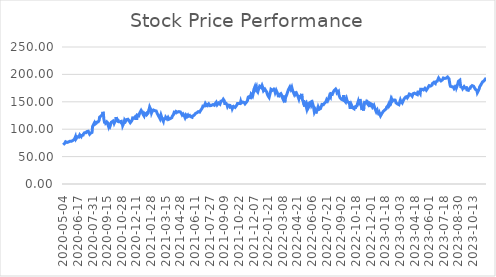
| Category | Series 0 |
|---|---|
| 2020-05-04 | 71.571 |
| 2020-05-05 | 72.645 |
| 2020-05-06 | 73.395 |
| 2020-05-07 | 74.154 |
| 2020-05-08 | 75.919 |
| 2020-05-11 | 77.114 |
| 2020-05-12 | 76.232 |
| 2020-05-13 | 75.312 |
| 2020-05-14 | 75.774 |
| 2020-05-15 | 75.326 |
| 2020-05-18 | 77.101 |
| 2020-05-19 | 76.656 |
| 2020-05-20 | 78.146 |
| 2020-05-21 | 77.564 |
| 2020-05-22 | 78.063 |
| 2020-05-26 | 77.534 |
| 2020-05-27 | 77.872 |
| 2020-05-28 | 77.907 |
| 2020-05-29 | 77.831 |
| 2020-06-01 | 78.788 |
| 2020-06-02 | 79.153 |
| 2020-06-03 | 79.588 |
| 2020-06-04 | 78.903 |
| 2020-06-05 | 81.15 |
| 2020-06-08 | 81.63 |
| 2020-06-09 | 84.208 |
| 2020-06-10 | 86.374 |
| 2020-06-11 | 82.227 |
| 2020-06-12 | 82.937 |
| 2020-06-15 | 83.963 |
| 2020-06-16 | 86.188 |
| 2020-06-17 | 86.068 |
| 2020-06-18 | 86.102 |
| 2020-06-19 | 85.61 |
| 2020-06-22 | 87.85 |
| 2020-06-23 | 89.725 |
| 2020-06-24 | 88.142 |
| 2020-06-25 | 89.312 |
| 2020-06-26 | 86.568 |
| 2020-06-29 | 88.563 |
| 2020-06-30 | 89.302 |
| 2020-07-01 | 89.133 |
| 2020-07-02 | 89.133 |
| 2020-07-06 | 91.517 |
| 2020-07-07 | 91.233 |
| 2020-07-08 | 93.358 |
| 2020-07-09 | 93.76 |
| 2020-07-10 | 93.924 |
| 2020-07-13 | 93.49 |
| 2020-07-14 | 95.038 |
| 2020-07-15 | 95.691 |
| 2020-07-16 | 94.514 |
| 2020-07-17 | 94.323 |
| 2020-07-20 | 96.31 |
| 2020-07-21 | 94.981 |
| 2020-07-22 | 95.248 |
| 2020-07-23 | 90.913 |
| 2020-07-24 | 90.688 |
| 2020-07-27 | 92.837 |
| 2020-07-28 | 91.312 |
| 2020-07-29 | 93.062 |
| 2020-07-30 | 94.188 |
| 2020-07-31 | 104.048 |
| 2020-08-03 | 106.67 |
| 2020-08-04 | 107.383 |
| 2020-08-05 | 107.772 |
| 2020-08-06 | 111.532 |
| 2020-08-07 | 108.996 |
| 2020-08-10 | 110.58 |
| 2020-08-11 | 107.292 |
| 2020-08-12 | 110.858 |
| 2020-08-13 | 112.819 |
| 2020-08-14 | 112.719 |
| 2020-08-17 | 112.425 |
| 2020-08-18 | 113.361 |
| 2020-08-19 | 113.504 |
| 2020-08-20 | 116.022 |
| 2020-08-21 | 122.001 |
| 2020-08-24 | 123.46 |
| 2020-08-25 | 122.448 |
| 2020-08-26 | 124.113 |
| 2020-08-27 | 122.629 |
| 2020-08-28 | 122.43 |
| 2020-08-31 | 126.582 |
| 2020-09-01 | 131.624 |
| 2020-09-02 | 128.897 |
| 2020-09-03 | 118.578 |
| 2020-09-04 | 118.656 |
| 2020-09-08 | 110.671 |
| 2020-09-09 | 115.085 |
| 2020-09-10 | 111.328 |
| 2020-09-11 | 109.867 |
| 2020-09-14 | 113.163 |
| 2020-09-15 | 113.339 |
| 2020-09-16 | 109.994 |
| 2020-09-17 | 108.238 |
| 2020-09-18 | 104.805 |
| 2020-09-21 | 107.983 |
| 2020-09-22 | 109.68 |
| 2020-09-23 | 105.08 |
| 2020-09-24 | 106.159 |
| 2020-09-25 | 110.141 |
| 2020-09-28 | 112.77 |
| 2020-09-29 | 111.917 |
| 2020-09-30 | 113.604 |
| 2020-10-01 | 114.566 |
| 2020-10-02 | 110.867 |
| 2020-10-05 | 114.281 |
| 2020-10-06 | 111.005 |
| 2020-10-07 | 112.888 |
| 2020-10-08 | 112.78 |
| 2020-10-09 | 114.742 |
| 2020-10-12 | 122.031 |
| 2020-10-13 | 118.793 |
| 2020-10-14 | 118.882 |
| 2020-10-15 | 118.411 |
| 2020-10-16 | 116.753 |
| 2020-10-19 | 113.771 |
| 2020-10-20 | 115.272 |
| 2020-10-21 | 114.644 |
| 2020-10-22 | 113.545 |
| 2020-10-23 | 112.849 |
| 2020-10-26 | 112.859 |
| 2020-10-27 | 114.379 |
| 2020-10-28 | 109.082 |
| 2020-10-29 | 113.124 |
| 2020-10-30 | 106.787 |
| 2020-11-02 | 106.698 |
| 2020-11-03 | 108.336 |
| 2020-11-04 | 112.761 |
| 2020-11-05 | 116.763 |
| 2020-11-06 | 116.63 |
| 2020-11-09 | 114.301 |
| 2020-11-10 | 113.957 |
| 2020-11-11 | 117.416 |
| 2020-11-12 | 117.141 |
| 2020-11-13 | 117.19 |
| 2020-11-16 | 118.212 |
| 2020-11-17 | 117.318 |
| 2020-11-18 | 115.982 |
| 2020-11-19 | 116.581 |
| 2020-11-20 | 115.304 |
| 2020-11-23 | 111.874 |
| 2020-11-24 | 113.171 |
| 2020-11-25 | 114.016 |
| 2020-11-27 | 114.567 |
| 2020-11-30 | 116.984 |
| 2020-12-01 | 120.59 |
| 2020-12-02 | 120.944 |
| 2020-12-03 | 120.806 |
| 2020-12-04 | 120.128 |
| 2020-12-07 | 121.602 |
| 2020-12-08 | 122.222 |
| 2020-12-09 | 119.667 |
| 2020-12-10 | 121.101 |
| 2020-12-11 | 120.286 |
| 2020-12-14 | 119.667 |
| 2020-12-15 | 125.661 |
| 2020-12-16 | 125.592 |
| 2020-12-17 | 126.466 |
| 2020-12-18 | 124.462 |
| 2020-12-21 | 126.005 |
| 2020-12-22 | 129.591 |
| 2020-12-23 | 128.687 |
| 2020-12-24 | 129.68 |
| 2020-12-28 | 134.318 |
| 2020-12-29 | 132.529 |
| 2020-12-30 | 131.399 |
| 2020-12-31 | 130.387 |
| 2021-01-04 | 127.164 |
| 2021-01-05 | 128.736 |
| 2021-01-06 | 124.403 |
| 2021-01-07 | 128.648 |
| 2021-01-08 | 129.758 |
| 2021-01-11 | 126.742 |
| 2021-01-12 | 126.565 |
| 2021-01-13 | 128.619 |
| 2021-01-14 | 126.673 |
| 2021-01-15 | 124.934 |
| 2021-01-19 | 125.612 |
| 2021-01-20 | 129.739 |
| 2021-01-21 | 134.495 |
| 2021-01-22 | 136.656 |
| 2021-01-25 | 140.44 |
| 2021-01-26 | 140.676 |
| 2021-01-27 | 139.595 |
| 2021-01-28 | 134.711 |
| 2021-01-29 | 129.67 |
| 2021-02-01 | 131.812 |
| 2021-02-02 | 132.647 |
| 2021-02-03 | 131.616 |
| 2021-02-04 | 135.006 |
| 2021-02-05 | 134.587 |
| 2021-02-08 | 134.735 |
| 2021-02-09 | 133.849 |
| 2021-02-10 | 133.239 |
| 2021-02-11 | 132.983 |
| 2021-02-12 | 133.22 |
| 2021-02-16 | 131.074 |
| 2021-02-17 | 128.762 |
| 2021-02-18 | 127.649 |
| 2021-02-19 | 127.807 |
| 2021-02-22 | 123.998 |
| 2021-02-23 | 123.861 |
| 2021-02-24 | 123.359 |
| 2021-02-25 | 119.068 |
| 2021-02-26 | 119.334 |
| 2021-03-01 | 125.76 |
| 2021-03-02 | 123.132 |
| 2021-03-03 | 120.121 |
| 2021-03-04 | 118.222 |
| 2021-03-05 | 119.491 |
| 2021-03-08 | 114.512 |
| 2021-03-09 | 119.166 |
| 2021-03-10 | 118.074 |
| 2021-03-11 | 120.022 |
| 2021-03-12 | 119.107 |
| 2021-03-15 | 122.02 |
| 2021-03-16 | 123.575 |
| 2021-03-17 | 122.778 |
| 2021-03-18 | 118.615 |
| 2021-03-19 | 118.084 |
| 2021-03-22 | 121.43 |
| 2021-03-23 | 120.593 |
| 2021-03-24 | 118.182 |
| 2021-03-25 | 118.674 |
| 2021-03-26 | 119.284 |
| 2021-03-29 | 119.462 |
| 2021-03-30 | 117.995 |
| 2021-03-31 | 120.21 |
| 2021-04-01 | 121.046 |
| 2021-04-05 | 123.9 |
| 2021-04-06 | 124.205 |
| 2021-04-07 | 125.868 |
| 2021-04-08 | 128.289 |
| 2021-04-09 | 130.887 |
| 2021-04-12 | 129.155 |
| 2021-04-13 | 132.294 |
| 2021-04-14 | 129.933 |
| 2021-04-15 | 132.363 |
| 2021-04-16 | 132.029 |
| 2021-04-19 | 132.698 |
| 2021-04-20 | 130.995 |
| 2021-04-21 | 131.379 |
| 2021-04-22 | 129.844 |
| 2021-04-23 | 132.186 |
| 2021-04-26 | 132.58 |
| 2021-04-27 | 132.255 |
| 2021-04-28 | 131.458 |
| 2021-04-29 | 131.36 |
| 2021-04-30 | 129.372 |
| 2021-05-03 | 130.435 |
| 2021-05-04 | 125.819 |
| 2021-05-05 | 126.065 |
| 2021-05-06 | 127.679 |
| 2021-05-07 | 128.359 |
| 2021-05-10 | 125.047 |
| 2021-05-11 | 124.12 |
| 2021-05-12 | 121.025 |
| 2021-05-13 | 123.194 |
| 2021-05-14 | 125.638 |
| 2021-05-17 | 124.475 |
| 2021-05-18 | 123.075 |
| 2021-05-19 | 122.918 |
| 2021-05-20 | 125.5 |
| 2021-05-21 | 123.647 |
| 2021-05-24 | 125.293 |
| 2021-05-25 | 125.096 |
| 2021-05-26 | 125.047 |
| 2021-05-27 | 123.499 |
| 2021-05-28 | 122.839 |
| 2021-06-01 | 122.513 |
| 2021-06-02 | 123.282 |
| 2021-06-03 | 121.784 |
| 2021-06-04 | 124.1 |
| 2021-06-07 | 124.11 |
| 2021-06-08 | 124.938 |
| 2021-06-09 | 125.323 |
| 2021-06-10 | 124.317 |
| 2021-06-11 | 125.54 |
| 2021-06-14 | 128.625 |
| 2021-06-15 | 127.797 |
| 2021-06-16 | 128.3 |
| 2021-06-17 | 129.917 |
| 2021-06-18 | 128.606 |
| 2021-06-21 | 130.419 |
| 2021-06-22 | 132.076 |
| 2021-06-23 | 131.8 |
| 2021-06-24 | 131.514 |
| 2021-06-25 | 131.218 |
| 2021-06-28 | 132.864 |
| 2021-06-29 | 134.392 |
| 2021-06-30 | 135.013 |
| 2021-07-01 | 135.319 |
| 2021-07-02 | 137.97 |
| 2021-07-06 | 140.001 |
| 2021-07-07 | 142.515 |
| 2021-07-08 | 141.204 |
| 2021-07-09 | 143.047 |
| 2021-07-12 | 142.446 |
| 2021-07-13 | 143.57 |
| 2021-07-14 | 147.03 |
| 2021-07-15 | 146.369 |
| 2021-07-16 | 144.309 |
| 2021-07-19 | 140.425 |
| 2021-07-20 | 144.073 |
| 2021-07-21 | 143.333 |
| 2021-07-22 | 144.713 |
| 2021-07-23 | 146.448 |
| 2021-07-26 | 146.872 |
| 2021-07-27 | 144.684 |
| 2021-07-28 | 142.919 |
| 2021-07-29 | 143.57 |
| 2021-07-30 | 143.787 |
| 2021-08-02 | 143.452 |
| 2021-08-03 | 145.265 |
| 2021-08-04 | 144.861 |
| 2021-08-05 | 144.97 |
| 2021-08-06 | 144.278 |
| 2021-08-09 | 144.229 |
| 2021-08-10 | 143.745 |
| 2021-08-11 | 144.002 |
| 2021-08-12 | 146.994 |
| 2021-08-13 | 147.201 |
| 2021-08-16 | 149.195 |
| 2021-08-17 | 148.277 |
| 2021-08-18 | 144.496 |
| 2021-08-19 | 144.831 |
| 2021-08-20 | 146.302 |
| 2021-08-23 | 147.803 |
| 2021-08-24 | 147.714 |
| 2021-08-25 | 146.47 |
| 2021-08-26 | 145.661 |
| 2021-08-27 | 146.707 |
| 2021-08-30 | 151.17 |
| 2021-08-31 | 149.896 |
| 2021-09-01 | 150.567 |
| 2021-09-02 | 151.693 |
| 2021-09-03 | 152.335 |
| 2021-09-07 | 154.694 |
| 2021-09-08 | 153.134 |
| 2021-09-09 | 152.108 |
| 2021-09-10 | 147.072 |
| 2021-09-13 | 147.645 |
| 2021-09-14 | 146.233 |
| 2021-09-15 | 147.132 |
| 2021-09-16 | 146.895 |
| 2021-09-17 | 144.2 |
| 2021-09-20 | 141.119 |
| 2021-09-21 | 141.603 |
| 2021-09-22 | 143.992 |
| 2021-09-23 | 144.96 |
| 2021-09-24 | 145.049 |
| 2021-09-27 | 143.518 |
| 2021-09-28 | 140.102 |
| 2021-09-29 | 141.011 |
| 2021-09-30 | 139.698 |
| 2021-10-01 | 140.833 |
| 2021-10-04 | 137.368 |
| 2021-10-05 | 139.313 |
| 2021-10-06 | 140.191 |
| 2021-10-07 | 141.465 |
| 2021-10-08 | 141.08 |
| 2021-10-11 | 140.991 |
| 2021-10-12 | 139.708 |
| 2021-10-13 | 139.115 |
| 2021-10-14 | 141.929 |
| 2021-10-15 | 142.995 |
| 2021-10-18 | 144.683 |
| 2021-10-19 | 146.865 |
| 2021-10-20 | 147.359 |
| 2021-10-21 | 147.576 |
| 2021-10-22 | 146.796 |
| 2021-10-25 | 146.747 |
| 2021-10-26 | 147.418 |
| 2021-10-27 | 146.954 |
| 2021-10-28 | 150.627 |
| 2021-10-29 | 147.892 |
| 2021-11-01 | 147.063 |
| 2021-11-02 | 148.109 |
| 2021-11-03 | 149.56 |
| 2021-11-04 | 149.037 |
| 2021-11-05 | 149.571 |
| 2021-11-08 | 148.74 |
| 2021-11-09 | 149.106 |
| 2021-11-10 | 146.249 |
| 2021-11-11 | 146.2 |
| 2021-11-12 | 148.296 |
| 2021-11-15 | 148.306 |
| 2021-11-16 | 149.294 |
| 2021-11-17 | 151.756 |
| 2021-11-18 | 156.087 |
| 2021-11-19 | 158.736 |
| 2021-11-22 | 159.201 |
| 2021-11-23 | 159.587 |
| 2021-11-24 | 160.111 |
| 2021-11-26 | 155.039 |
| 2021-11-29 | 158.43 |
| 2021-11-30 | 163.433 |
| 2021-12-01 | 162.909 |
| 2021-12-02 | 161.91 |
| 2021-12-03 | 160.012 |
| 2021-12-06 | 163.452 |
| 2021-12-07 | 169.246 |
| 2021-12-08 | 173.102 |
| 2021-12-09 | 172.588 |
| 2021-12-10 | 177.423 |
| 2021-12-13 | 173.755 |
| 2021-12-14 | 172.361 |
| 2021-12-15 | 177.274 |
| 2021-12-16 | 170.314 |
| 2021-12-17 | 169.207 |
| 2021-12-20 | 167.832 |
| 2021-12-21 | 171.036 |
| 2021-12-22 | 173.656 |
| 2021-12-23 | 174.289 |
| 2021-12-27 | 178.293 |
| 2021-12-28 | 177.265 |
| 2021-12-29 | 177.354 |
| 2021-12-30 | 176.187 |
| 2021-12-31 | 175.564 |
| 2022-01-03 | 179.954 |
| 2022-01-04 | 177.67 |
| 2022-01-05 | 172.944 |
| 2022-01-06 | 170.057 |
| 2022-01-07 | 170.225 |
| 2022-01-10 | 170.245 |
| 2022-01-11 | 173.102 |
| 2022-01-12 | 173.547 |
| 2022-01-13 | 170.245 |
| 2022-01-14 | 171.115 |
| 2022-01-18 | 167.882 |
| 2022-01-19 | 164.352 |
| 2022-01-20 | 162.652 |
| 2022-01-21 | 160.575 |
| 2022-01-24 | 159.794 |
| 2022-01-25 | 157.975 |
| 2022-01-26 | 157.886 |
| 2022-01-27 | 157.421 |
| 2022-01-28 | 168.406 |
| 2022-01-31 | 172.806 |
| 2022-02-01 | 172.638 |
| 2022-02-02 | 173.854 |
| 2022-02-03 | 170.947 |
| 2022-02-04 | 170.66 |
| 2022-02-07 | 169.937 |
| 2022-02-08 | 173.075 |
| 2022-02-09 | 174.511 |
| 2022-02-10 | 170.392 |
| 2022-02-11 | 166.947 |
| 2022-02-14 | 167.185 |
| 2022-02-15 | 171.056 |
| 2022-02-16 | 170.818 |
| 2022-02-17 | 167.185 |
| 2022-02-18 | 165.621 |
| 2022-02-22 | 162.671 |
| 2022-02-23 | 158.463 |
| 2022-02-24 | 161.107 |
| 2022-02-25 | 163.195 |
| 2022-02-28 | 163.463 |
| 2022-03-01 | 161.562 |
| 2022-03-02 | 164.888 |
| 2022-03-03 | 164.562 |
| 2022-03-04 | 161.532 |
| 2022-03-07 | 157.701 |
| 2022-03-08 | 155.86 |
| 2022-03-09 | 161.314 |
| 2022-03-10 | 156.929 |
| 2022-03-11 | 153.177 |
| 2022-03-14 | 149.108 |
| 2022-03-15 | 153.533 |
| 2022-03-16 | 157.988 |
| 2022-03-17 | 159.008 |
| 2022-03-18 | 162.334 |
| 2022-03-21 | 163.72 |
| 2022-03-22 | 167.126 |
| 2022-03-23 | 168.502 |
| 2022-03-24 | 172.323 |
| 2022-03-25 | 172.966 |
| 2022-03-28 | 173.838 |
| 2022-03-29 | 177.164 |
| 2022-03-30 | 175.986 |
| 2022-03-31 | 172.857 |
| 2022-04-01 | 172.56 |
| 2022-04-04 | 176.649 |
| 2022-04-05 | 173.303 |
| 2022-04-06 | 170.105 |
| 2022-04-07 | 170.412 |
| 2022-04-08 | 168.383 |
| 2022-04-11 | 164.086 |
| 2022-04-12 | 165.977 |
| 2022-04-13 | 168.69 |
| 2022-04-14 | 163.631 |
| 2022-04-18 | 163.413 |
| 2022-04-19 | 165.72 |
| 2022-04-20 | 165.552 |
| 2022-04-21 | 164.75 |
| 2022-04-22 | 160.166 |
| 2022-04-25 | 161.245 |
| 2022-04-26 | 155.226 |
| 2022-04-27 | 154.998 |
| 2022-04-28 | 161.998 |
| 2022-04-29 | 156.068 |
| 2022-05-02 | 156.375 |
| 2022-05-03 | 157.879 |
| 2022-05-04 | 164.354 |
| 2022-05-05 | 155.196 |
| 2022-05-06 | 155.93 |
| 2022-05-09 | 150.755 |
| 2022-05-10 | 153.184 |
| 2022-05-11 | 145.243 |
| 2022-05-12 | 141.336 |
| 2022-05-13 | 145.847 |
| 2022-05-16 | 144.291 |
| 2022-05-17 | 147.959 |
| 2022-05-18 | 139.611 |
| 2022-05-19 | 136.171 |
| 2022-05-20 | 136.409 |
| 2022-05-23 | 141.882 |
| 2022-05-24 | 139.155 |
| 2022-05-25 | 139.314 |
| 2022-05-26 | 142.546 |
| 2022-05-27 | 148.356 |
| 2022-05-31 | 147.563 |
| 2022-06-01 | 147.434 |
| 2022-06-02 | 149.912 |
| 2022-06-03 | 144.132 |
| 2022-06-06 | 144.886 |
| 2022-06-07 | 147.434 |
| 2022-06-08 | 146.69 |
| 2022-06-09 | 141.416 |
| 2022-06-10 | 135.953 |
| 2022-06-13 | 130.748 |
| 2022-06-14 | 131.621 |
| 2022-06-15 | 134.268 |
| 2022-06-16 | 128.944 |
| 2022-06-17 | 130.431 |
| 2022-06-21 | 134.704 |
| 2022-06-22 | 134.188 |
| 2022-06-23 | 137.083 |
| 2022-06-24 | 140.444 |
| 2022-06-27 | 140.444 |
| 2022-06-28 | 136.26 |
| 2022-06-29 | 138.035 |
| 2022-06-30 | 135.547 |
| 2022-07-01 | 137.738 |
| 2022-07-05 | 140.345 |
| 2022-07-06 | 141.693 |
| 2022-07-07 | 145.094 |
| 2022-07-08 | 145.778 |
| 2022-07-11 | 143.627 |
| 2022-07-12 | 144.608 |
| 2022-07-13 | 144.241 |
| 2022-07-14 | 147.196 |
| 2022-07-15 | 148.881 |
| 2022-07-18 | 145.808 |
| 2022-07-19 | 149.704 |
| 2022-07-20 | 151.726 |
| 2022-07-21 | 154.017 |
| 2022-07-22 | 152.768 |
| 2022-07-25 | 151.637 |
| 2022-07-26 | 150.299 |
| 2022-07-27 | 155.444 |
| 2022-07-28 | 156 |
| 2022-07-29 | 161.115 |
| 2022-08-01 | 160.124 |
| 2022-08-02 | 158.637 |
| 2022-08-03 | 164.704 |
| 2022-08-04 | 164.387 |
| 2022-08-05 | 164.159 |
| 2022-08-08 | 163.682 |
| 2022-08-09 | 163.732 |
| 2022-08-10 | 168.021 |
| 2022-08-11 | 167.276 |
| 2022-08-12 | 170.86 |
| 2022-08-15 | 171.942 |
| 2022-08-16 | 171.783 |
| 2022-08-17 | 173.292 |
| 2022-08-18 | 172.895 |
| 2022-08-19 | 170.284 |
| 2022-08-22 | 166.363 |
| 2022-08-23 | 166.025 |
| 2022-08-24 | 166.323 |
| 2022-08-25 | 168.805 |
| 2022-08-26 | 162.441 |
| 2022-08-29 | 160.217 |
| 2022-08-30 | 157.765 |
| 2022-08-31 | 156.087 |
| 2022-09-01 | 156.822 |
| 2022-09-02 | 154.687 |
| 2022-09-06 | 153.417 |
| 2022-09-07 | 154.836 |
| 2022-09-08 | 153.347 |
| 2022-09-09 | 156.236 |
| 2022-09-12 | 162.252 |
| 2022-09-13 | 152.732 |
| 2022-09-14 | 154.191 |
| 2022-09-15 | 151.272 |
| 2022-09-16 | 149.614 |
| 2022-09-19 | 153.367 |
| 2022-09-20 | 155.77 |
| 2022-09-21 | 152.612 |
| 2022-09-22 | 151.64 |
| 2022-09-23 | 149.346 |
| 2022-09-26 | 149.684 |
| 2022-09-27 | 150.666 |
| 2022-09-28 | 148.76 |
| 2022-09-29 | 141.453 |
| 2022-09-30 | 137.204 |
| 2022-10-03 | 141.424 |
| 2022-10-04 | 145.047 |
| 2022-10-05 | 145.345 |
| 2022-10-06 | 144.382 |
| 2022-10-07 | 139.081 |
| 2022-10-10 | 139.408 |
| 2022-10-11 | 137.979 |
| 2022-10-12 | 137.343 |
| 2022-10-13 | 141.96 |
| 2022-10-14 | 137.383 |
| 2022-10-17 | 141.384 |
| 2022-10-18 | 142.714 |
| 2022-10-19 | 142.823 |
| 2022-10-20 | 142.357 |
| 2022-10-21 | 146.209 |
| 2022-10-24 | 148.373 |
| 2022-10-25 | 151.242 |
| 2022-10-26 | 148.274 |
| 2022-10-27 | 143.757 |
| 2022-10-28 | 154.618 |
| 2022-10-31 | 152.235 |
| 2022-11-01 | 149.564 |
| 2022-11-02 | 143.985 |
| 2022-11-03 | 137.879 |
| 2022-11-04 | 137.611 |
| 2022-11-07 | 138.148 |
| 2022-11-08 | 138.725 |
| 2022-11-09 | 134.12 |
| 2022-11-10 | 146.054 |
| 2022-11-11 | 148.868 |
| 2022-11-14 | 147.456 |
| 2022-11-15 | 149.206 |
| 2022-11-16 | 147.963 |
| 2022-11-17 | 149.882 |
| 2022-11-18 | 150.449 |
| 2022-11-21 | 147.187 |
| 2022-11-22 | 149.345 |
| 2022-11-23 | 150.23 |
| 2022-11-25 | 147.287 |
| 2022-11-28 | 143.418 |
| 2022-11-29 | 140.385 |
| 2022-11-30 | 147.207 |
| 2022-12-01 | 147.486 |
| 2022-12-02 | 146.988 |
| 2022-12-05 | 145.815 |
| 2022-12-06 | 142.116 |
| 2022-12-07 | 140.157 |
| 2022-12-08 | 141.857 |
| 2022-12-09 | 141.37 |
| 2022-12-12 | 143.687 |
| 2022-12-13 | 144.661 |
| 2022-12-14 | 142.414 |
| 2022-12-15 | 135.741 |
| 2022-12-16 | 133.762 |
| 2022-12-19 | 131.634 |
| 2022-12-20 | 131.565 |
| 2022-12-21 | 134.697 |
| 2022-12-22 | 131.495 |
| 2022-12-23 | 131.127 |
| 2022-12-27 | 129.307 |
| 2022-12-28 | 125.339 |
| 2022-12-29 | 128.89 |
| 2022-12-30 | 129.208 |
| 2023-01-03 | 124.375 |
| 2023-01-04 | 125.658 |
| 2023-01-05 | 124.325 |
| 2023-01-06 | 128.899 |
| 2023-01-09 | 129.427 |
| 2023-01-10 | 130.003 |
| 2023-01-11 | 132.748 |
| 2023-01-12 | 132.668 |
| 2023-01-13 | 134.011 |
| 2023-01-17 | 135.184 |
| 2023-01-18 | 134.458 |
| 2023-01-19 | 134.518 |
| 2023-01-20 | 137.104 |
| 2023-01-23 | 140.326 |
| 2023-01-24 | 141.738 |
| 2023-01-25 | 141.072 |
| 2023-01-26 | 143.16 |
| 2023-01-27 | 145.119 |
| 2023-01-30 | 142.205 |
| 2023-01-31 | 143.488 |
| 2023-02-01 | 144.622 |
| 2023-02-02 | 149.982 |
| 2023-02-03 | 153.641 |
| 2023-02-06 | 150.887 |
| 2023-02-07 | 153.79 |
| 2023-02-08 | 151.076 |
| 2023-02-09 | 150.031 |
| 2023-02-10 | 150.4 |
| 2023-02-13 | 153.228 |
| 2023-02-14 | 152.581 |
| 2023-02-15 | 154.702 |
| 2023-02-16 | 153.089 |
| 2023-02-17 | 151.934 |
| 2023-02-21 | 147.88 |
| 2023-02-22 | 148.308 |
| 2023-02-23 | 148.796 |
| 2023-02-24 | 146.117 |
| 2023-02-27 | 147.322 |
| 2023-02-28 | 146.814 |
| 2023-03-01 | 144.723 |
| 2023-03-02 | 145.32 |
| 2023-03-03 | 150.42 |
| 2023-03-06 | 153.208 |
| 2023-03-07 | 150.988 |
| 2023-03-08 | 152.252 |
| 2023-03-09 | 149.982 |
| 2023-03-10 | 147.9 |
| 2023-03-13 | 149.862 |
| 2023-03-14 | 151.974 |
| 2023-03-15 | 152.372 |
| 2023-03-16 | 155.22 |
| 2023-03-17 | 154.374 |
| 2023-03-20 | 156.764 |
| 2023-03-21 | 158.636 |
| 2023-03-22 | 157.192 |
| 2023-03-23 | 158.288 |
| 2023-03-24 | 159.603 |
| 2023-03-27 | 157.64 |
| 2023-03-28 | 157.013 |
| 2023-03-29 | 160.12 |
| 2023-03-30 | 161.704 |
| 2023-03-31 | 164.234 |
| 2023-04-03 | 165.499 |
| 2023-04-04 | 164.961 |
| 2023-04-05 | 163.098 |
| 2023-04-06 | 163.995 |
| 2023-04-10 | 161.375 |
| 2023-04-11 | 160.15 |
| 2023-04-12 | 159.453 |
| 2023-04-13 | 164.891 |
| 2023-04-14 | 164.542 |
| 2023-04-17 | 164.562 |
| 2023-04-18 | 165.797 |
| 2023-04-19 | 166.953 |
| 2023-04-20 | 165.977 |
| 2023-04-21 | 164.353 |
| 2023-04-24 | 164.662 |
| 2023-04-25 | 163.108 |
| 2023-04-26 | 163.098 |
| 2023-04-27 | 167.73 |
| 2023-04-28 | 168.994 |
| 2023-05-01 | 168.905 |
| 2023-05-02 | 167.859 |
| 2023-05-03 | 166.774 |
| 2023-05-04 | 165.12 |
| 2023-05-05 | 172.869 |
| 2023-05-08 | 172.799 |
| 2023-05-09 | 171.076 |
| 2023-05-10 | 172.859 |
| 2023-05-11 | 173.048 |
| 2023-05-12 | 172.11 |
| 2023-05-15 | 171.612 |
| 2023-05-16 | 171.612 |
| 2023-05-17 | 172.23 |
| 2023-05-18 | 174.584 |
| 2023-05-19 | 174.694 |
| 2023-05-22 | 173.736 |
| 2023-05-23 | 171.103 |
| 2023-05-24 | 171.382 |
| 2023-05-25 | 172.529 |
| 2023-05-26 | 174.963 |
| 2023-05-30 | 176.828 |
| 2023-05-31 | 176.778 |
| 2023-06-01 | 179.61 |
| 2023-06-02 | 180.468 |
| 2023-06-05 | 179.102 |
| 2023-06-06 | 178.733 |
| 2023-06-07 | 177.347 |
| 2023-06-08 | 180.089 |
| 2023-06-09 | 180.478 |
| 2023-06-12 | 183.301 |
| 2023-06-13 | 182.822 |
| 2023-06-14 | 183.46 |
| 2023-06-15 | 185.515 |
| 2023-06-16 | 184.428 |
| 2023-06-20 | 184.517 |
| 2023-06-21 | 183.47 |
| 2023-06-22 | 186.502 |
| 2023-06-23 | 186.183 |
| 2023-06-26 | 184.777 |
| 2023-06-27 | 187.559 |
| 2023-06-28 | 188.746 |
| 2023-06-29 | 189.085 |
| 2023-06-30 | 193.454 |
| 2023-07-03 | 191.948 |
| 2023-07-05 | 190.821 |
| 2023-07-06 | 191.299 |
| 2023-07-07 | 190.172 |
| 2023-07-10 | 188.108 |
| 2023-07-11 | 187.579 |
| 2023-07-12 | 189.265 |
| 2023-07-13 | 190.033 |
| 2023-07-14 | 190.182 |
| 2023-07-17 | 193.474 |
| 2023-07-18 | 193.214 |
| 2023-07-19 | 194.58 |
| 2023-07-20 | 192.616 |
| 2023-07-21 | 191.429 |
| 2023-07-24 | 192.237 |
| 2023-07-25 | 193.104 |
| 2023-07-26 | 193.982 |
| 2023-07-27 | 192.706 |
| 2023-07-28 | 195.309 |
| 2023-07-31 | 195.927 |
| 2023-08-01 | 195.089 |
| 2023-08-02 | 192.067 |
| 2023-08-03 | 190.661 |
| 2023-08-04 | 181.506 |
| 2023-08-07 | 178.374 |
| 2023-08-08 | 179.321 |
| 2023-08-09 | 177.716 |
| 2023-08-10 | 177.496 |
| 2023-08-11 | 177.556 |
| 2023-08-14 | 179.224 |
| 2023-08-15 | 177.216 |
| 2023-08-16 | 176.338 |
| 2023-08-17 | 173.771 |
| 2023-08-18 | 174.26 |
| 2023-08-21 | 175.609 |
| 2023-08-22 | 176.997 |
| 2023-08-23 | 180.882 |
| 2023-08-24 | 176.148 |
| 2023-08-25 | 178.375 |
| 2023-08-28 | 179.953 |
| 2023-08-29 | 183.878 |
| 2023-08-30 | 187.403 |
| 2023-08-31 | 187.623 |
| 2023-09-01 | 189.211 |
| 2023-09-05 | 189.45 |
| 2023-09-06 | 182.669 |
| 2023-09-07 | 177.326 |
| 2023-09-08 | 177.946 |
| 2023-09-11 | 179.124 |
| 2023-09-12 | 176.068 |
| 2023-09-13 | 173.981 |
| 2023-09-14 | 175.509 |
| 2023-09-15 | 174.78 |
| 2023-09-18 | 177.736 |
| 2023-09-19 | 178.834 |
| 2023-09-20 | 175.259 |
| 2023-09-21 | 173.701 |
| 2023-09-22 | 174.56 |
| 2023-09-25 | 175.848 |
| 2023-09-26 | 171.734 |
| 2023-09-27 | 170.206 |
| 2023-09-28 | 170.465 |
| 2023-09-29 | 170.985 |
| 2023-10-02 | 173.521 |
| 2023-10-03 | 172.173 |
| 2023-10-04 | 173.432 |
| 2023-10-05 | 174.68 |
| 2023-10-06 | 177.256 |
| 2023-10-09 | 178.754 |
| 2023-10-10 | 178.155 |
| 2023-10-11 | 179.563 |
| 2023-10-12 | 180.472 |
| 2023-10-13 | 178.615 |
| 2023-10-16 | 178.485 |
| 2023-10-17 | 176.917 |
| 2023-10-18 | 175.609 |
| 2023-10-19 | 175.229 |
| 2023-10-20 | 172.652 |
| 2023-10-23 | 172.772 |
| 2023-10-24 | 173.212 |
| 2023-10-25 | 170.875 |
| 2023-10-26 | 166.67 |
| 2023-10-27 | 167.999 |
| 2023-10-30 | 170.066 |
| 2023-10-31 | 170.545 |
| 2023-11-01 | 173.741 |
| 2023-11-02 | 177.336 |
| 2023-11-03 | 176.418 |
| 2023-11-06 | 178.994 |
| 2023-11-07 | 181.581 |
| 2023-11-08 | 182.649 |
| 2023-11-09 | 182.17 |
| 2023-11-10 | 186.4 |
| 2023-11-13 | 184.8 |
| 2023-11-14 | 187.44 |
| 2023-11-15 | 188.01 |
| 2023-11-16 | 189.71 |
| 2023-11-17 | 189.69 |
| 2023-11-20 | 191.45 |
| 2023-11-21 | 190.64 |
| 2023-11-22 | 191.31 |
| 2023-11-24 | 189.97 |